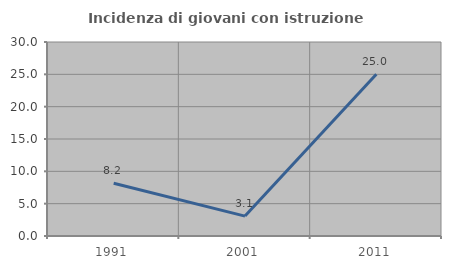
| Category | Incidenza di giovani con istruzione universitaria |
|---|---|
| 1991.0 | 8.163 |
| 2001.0 | 3.077 |
| 2011.0 | 25 |